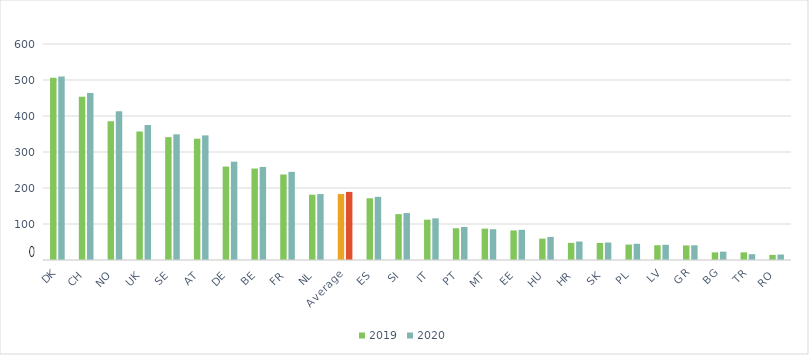
| Category | 2019 | 2020 |
|---|---|---|
| DK | 506.173 | 510.045 |
| CH | 453.698 | 464.073 |
| NO | 385.414 | 413.149 |
| UK | 356.635 | 374.979 |
| SE | 341.213 | 349.077 |
| AT | 336.954 | 346.138 |
| DE | 259.554 | 273.186 |
| BE | 254.078 | 258.516 |
| FR | 237.536 | 244.935 |
| NL | 181.401 | 183.196 |
| Average | 183.245 | 189.185 |
| ES | 171.506 | 175.524 |
| SI | 127.459 | 130.438 |
| IT | 111.979 | 115.691 |
| PT | 88.161 | 91.784 |
| MT | 87.122 | 85.451 |
| EE | 82.163 | 83.843 |
| HU | 59.33 | 64.041 |
| HR | 47.643 | 51.288 |
| SK | 47.336 | 48.554 |
| PL | 42.883 | 45.064 |
| LV | 40.938 | 42.304 |
| GR | 40.561 | 40.864 |
| BG | 21.184 | 23.176 |
| TR | 21.236 | 16.032 |
| RO | 14.287 | 15.248 |